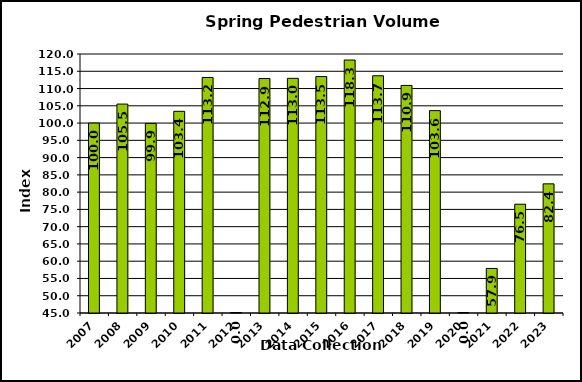
| Category | Spring Indicator |
|---|---|
| 2007.0 | 100 |
| 2008.0 | 105.5 |
| 2009.0 | 99.9 |
| 2010.0 | 103.4 |
| 2011.0 | 113.2 |
| 2012.0 | 0 |
| 2013.0 | 112.9 |
| 2014.0 | 112.953 |
| 2015.0 | 113.466 |
| 2016.0 | 118.254 |
| 2017.0 | 113.696 |
| 2018.0 | 110.9 |
| 2019.0 | 103.6 |
| 2020.0 | 0 |
| 2021.0 | 57.9 |
| 2022.0 | 76.5 |
| 2023.0 | 82.4 |